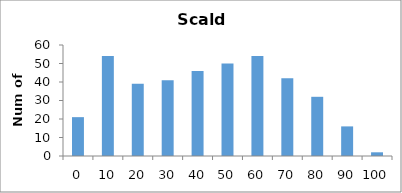
| Category | Series 0 |
|---|---|
| 0.0 | 21 |
| 10.0 | 54 |
| 20.0 | 39 |
| 30.0 | 41 |
| 40.0 | 46 |
| 50.0 | 50 |
| 60.0 | 54 |
| 70.0 | 42 |
| 80.0 | 32 |
| 90.0 | 16 |
| 100.0 | 2 |